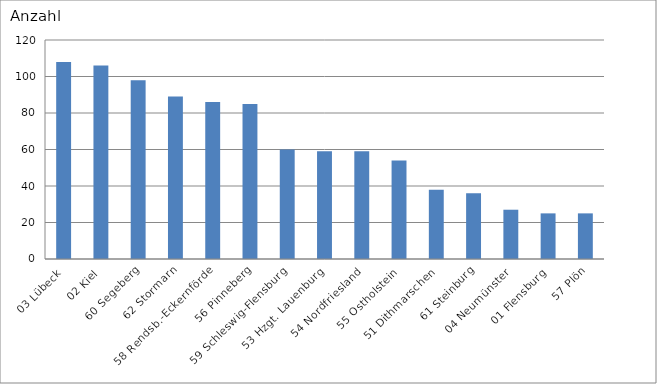
| Category | 03 Lübeck 02 Kiel 60 Segeberg 62 Stormarn 58 Rendsb.-Eckernförde 56 Pinneberg 59 Schleswig-Flensburg 53 Hzgt. Lauenburg 54 Nordfriesland 55 Ostholstein 51 Dithmarschen 61 Steinburg 04 Neumünster 01 Flensburg 57 Plön |
|---|---|
| 03 Lübeck | 108 |
| 02 Kiel | 106 |
| 60 Segeberg | 98 |
| 62 Stormarn | 89 |
| 58 Rendsb.-Eckernförde | 86 |
| 56 Pinneberg | 85 |
| 59 Schleswig-Flensburg | 60 |
| 53 Hzgt. Lauenburg | 59 |
| 54 Nordfriesland | 59 |
| 55 Ostholstein | 54 |
| 51 Dithmarschen | 38 |
| 61 Steinburg | 36 |
| 04 Neumünster | 27 |
| 01 Flensburg | 25 |
| 57 Plön | 25 |